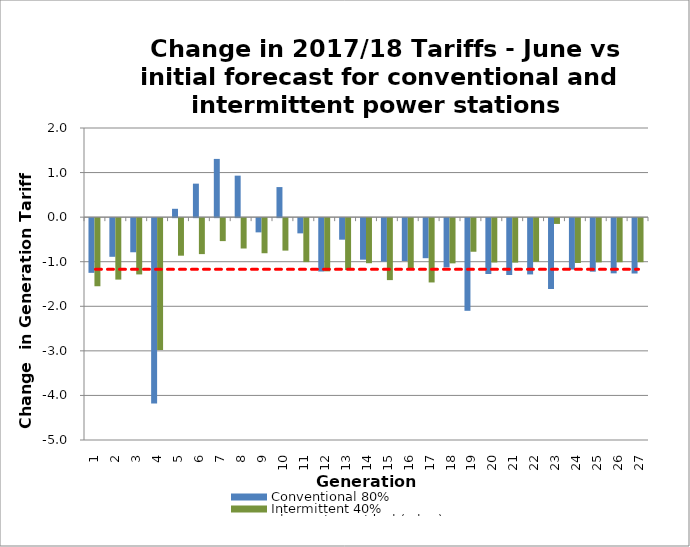
| Category | Conventional 80% | Intermittent 40% |
|---|---|---|
| 0 | -1.227 | -1.528 |
| 1 | -0.867 | -1.379 |
| 2 | -0.765 | -1.263 |
| 3 | -4.158 | -2.96 |
| 4 | 0.187 | -0.842 |
| 5 | 0.752 | -0.807 |
| 6 | 1.307 | -0.515 |
| 7 | 0.931 | -0.681 |
| 8 | -0.319 | -0.787 |
| 9 | 0.675 | -0.728 |
| 10 | -0.341 | -0.987 |
| 11 | -1.198 | -1.193 |
| 12 | -0.483 | -1.166 |
| 13 | -0.932 | -1.011 |
| 14 | -0.976 | -1.39 |
| 15 | -0.962 | -1.121 |
| 16 | -0.899 | -1.443 |
| 17 | -1.105 | -1.014 |
| 18 | -2.079 | -0.754 |
| 19 | -1.254 | -0.995 |
| 20 | -1.276 | -0.998 |
| 21 | -1.263 | -0.98 |
| 22 | -1.59 | -0.13 |
| 23 | -1.153 | -1.006 |
| 24 | -1.201 | -0.992 |
| 25 | -1.239 | -0.989 |
| 26 | -1.242 | -0.988 |